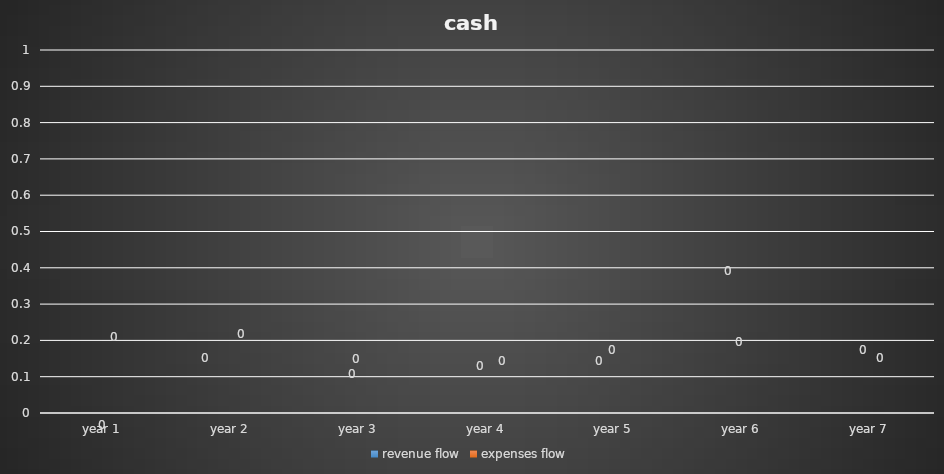
| Category | revenue flow | expenses flow |
|---|---|---|
| year 1 | 0 | 0 |
| year 2 | 0 | 0 |
| year 3 | 0 | 0 |
| year 4 | 0 | 0 |
| year 5 | 0 | 0 |
| year 6 | 0 | 0 |
| year 7 | 0 | 0 |